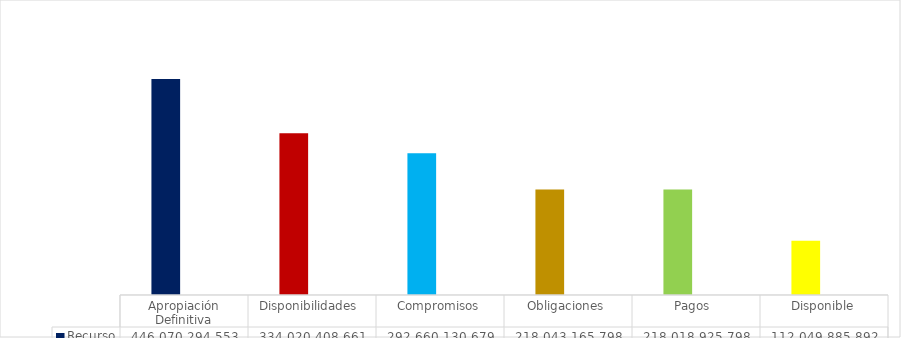
| Category | Recurso  | % |
|---|---|---|
| Apropiación Definitiva | 446070294553.29 | 1 |
| Disponibilidades  | 334020408661.44 | 0.749 |
| Compromisos | 292660130679.49 | 0.656 |
| Obligaciones | 218043165798.35 | 0.489 |
| Pagos  | 218018925798.35 | 0.489 |
| Disponible | 112049885891.85 | 0.251 |